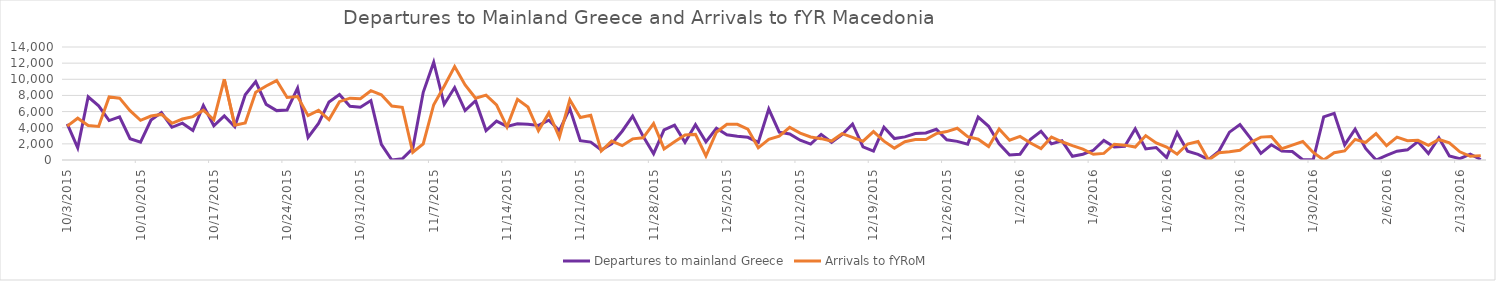
| Category | Departures to mainland Greece | Arrivals to fYRoM |
|---|---|---|
| 10/3/15 | 4480 | 4202 |
| 10/4/15 | 1513 | 5181 |
| 10/5/15 | 7833 | 4282 |
| 10/6/15 | 6707 | 4156 |
| 10/7/15 | 4886 | 7816 |
| 10/8/15 | 5349 | 7663 |
| 10/9/15 | 2631 | 6107 |
| 10/10/15 | 2214 | 4922 |
| 10/11/15 | 4950 | 5448 |
| 10/12/15 | 5879 | 5645 |
| 10/13/15 | 4052 | 4551 |
| 10/14/15 | 4564 | 5073 |
| 10/15/15 | 3660 | 5373 |
| 10/16/15 | 6743 | 6181 |
| 10/17/15 | 4239 | 4988 |
| 10/18/15 | 5457 | 10005 |
| 10/19/15 | 4119 | 4299 |
| 10/20/15 | 8083 | 4584 |
| 10/21/15 | 9725 | 8384 |
| 10/22/15 | 6896 | 9174 |
| 10/23/15 | 6120 | 9840 |
| 10/24/15 | 6195 | 7752 |
| 10/25/15 | 8916 | 7864 |
| 10/26/15 | 2804 | 5500 |
| 10/27/15 | 4540 | 6146 |
| 10/28/15 | 7191 | 5000 |
| 10/29/15 | 8117 | 7231 |
| 10/30/15 | 6649 | 7663 |
| 10/31/15 | 6537 | 7590 |
| 11/1/15 | 7360 | 8584 |
| 11/2/15 | 1935 | 8075 |
| 11/3/15 | 0 | 6682 |
| 11/4/15 | 142 | 6532 |
| 11/5/15 | 1430 | 960 |
| 11/6/15 | 8392 | 1987 |
| 11/7/15 | 12116 | 6847 |
| 11/8/15 | 6902 | 9148 |
| 11/9/15 | 8977 | 11572 |
| 11/10/15 | 6133 | 9305 |
| 11/11/15 | 7354 | 7651 |
| 11/12/15 | 3650 | 8038 |
| 11/13/15 | 4820 | 6826 |
| 11/14/15 | 4171 | 4107 |
| 11/15/15 | 4497 | 7511 |
| 11/16/15 | 4442 | 6557 |
| 11/17/15 | 4289 | 3621 |
| 11/18/15 | 4927 | 5831 |
| 11/19/15 | 3644 | 2816 |
| 11/20/15 | 6389 | 7453 |
| 11/21/15 | 2401 | 5255 |
| 11/22/15 | 2214 | 5539 |
| 11/23/15 | 1245 | 1113 |
| 11/24/15 | 2006 | 2347 |
| 11/25/15 | 3565 | 1779 |
| 11/26/15 | 5435 | 2617 |
| 11/27/15 | 2932 | 2744 |
| 11/28/15 | 778 | 4520 |
| 11/29/15 | 3736 | 1373 |
| 11/30/15 | 4318 | 2270 |
| 12/1/15 | 2181 | 3094 |
| 12/2/15 | 4384 | 3174 |
| 12/3/15 | 2255 | 494 |
| 12/4/15 | 3934 | 3436 |
| 12/5/15 | 3115 | 4430 |
| 12/6/15 | 2943 | 4425 |
| 12/7/15 | 2810 | 3826 |
| 12/8/15 | 2189 | 1508 |
| 12/9/15 | 6316 | 2550 |
| 12/10/15 | 3456 | 2956 |
| 12/11/15 | 3219 | 4047 |
| 12/12/15 | 2453 | 3338 |
| 12/13/15 | 1976 | 2849 |
| 12/14/15 | 3175 | 2644 |
| 12/15/15 | 2191 | 2349 |
| 12/16/15 | 3137 | 3264 |
| 12/17/15 | 4461 | 2801 |
| 12/18/15 | 1638 | 2332 |
| 12/19/15 | 1110 | 3515 |
| 12/20/15 | 4070 | 2338 |
| 12/21/15 | 2652 | 1470 |
| 12/22/15 | 2864 | 2272 |
| 12/23/15 | 3278 | 2529 |
| 12/24/15 | 3349 | 2529 |
| 12/25/15 | 3806 | 3268 |
| 12/26/15 | 2498 | 3521 |
| 12/27/15 | 2311 | 3938 |
| 12/28/15 | 1946 | 2884 |
| 12/29/15 | 5309 | 2577 |
| 12/30/15 | 4178 | 1665 |
| 12/31/15 | 2009 | 3848 |
| 1/1/16 | 623 | 2454 |
| 1/2/16 | 720 | 2918 |
| 1/3/16 | 2569 | 2112 |
| 1/4/16 | 3563 | 1415 |
| 1/5/16 | 1998 | 2842 |
| 1/6/16 | 2377 | 2258 |
| 1/7/16 | 463 | 1776 |
| 1/8/16 | 716 | 1344 |
| 1/9/16 | 1203 | 715 |
| 1/10/16 | 2417 | 819 |
| 1/11/16 | 1621 | 1959 |
| 1/12/16 | 1701 | 1840 |
| 1/13/16 | 3861 | 1600 |
| 1/14/16 | 1378 | 3022 |
| 1/15/16 | 1551 | 2119 |
| 1/16/16 | 301 | 1598 |
| 1/17/16 | 3378 | 720 |
| 1/18/16 | 1078 | 1980 |
| 1/19/16 | 695 | 2298 |
| 1/20/16 | 50 | 0 |
| 1/21/16 | 1108 | 892 |
| 1/22/16 | 3451 | 1030 |
| 1/23/16 | 4397 | 1208 |
| 1/24/16 | 2706 | 2174 |
| 1/25/16 | 819 | 2836 |
| 1/26/16 | 1887 | 2908 |
| 1/27/16 | 1098 | 1402 |
| 1/28/16 | 1046 | 1837 |
| 1/29/16 | 40 | 2292 |
| 1/30/16 | 53 | 931 |
| 1/31/16 | 5342 | 0 |
| 2/1/16 | 5783 | 908 |
| 2/2/16 | 1878 | 1121 |
| 2/3/16 | 3829 | 2558 |
| 2/4/16 | 1436 | 2173 |
| 2/5/16 | 0 | 3259 |
| 2/6/16 | 578 | 1780 |
| 2/7/16 | 1097 | 2838 |
| 2/8/16 | 1259 | 2392 |
| 2/9/16 | 2283 | 2441 |
| 2/10/16 | 793 | 1817 |
| 2/11/16 | 2756 | 2540 |
| 2/12/16 | 496 | 2115 |
| 2/13/16 | 161 | 1019 |
| 2/14/16 | 724 | 452 |
| 2/15/16 | 65 | 542 |